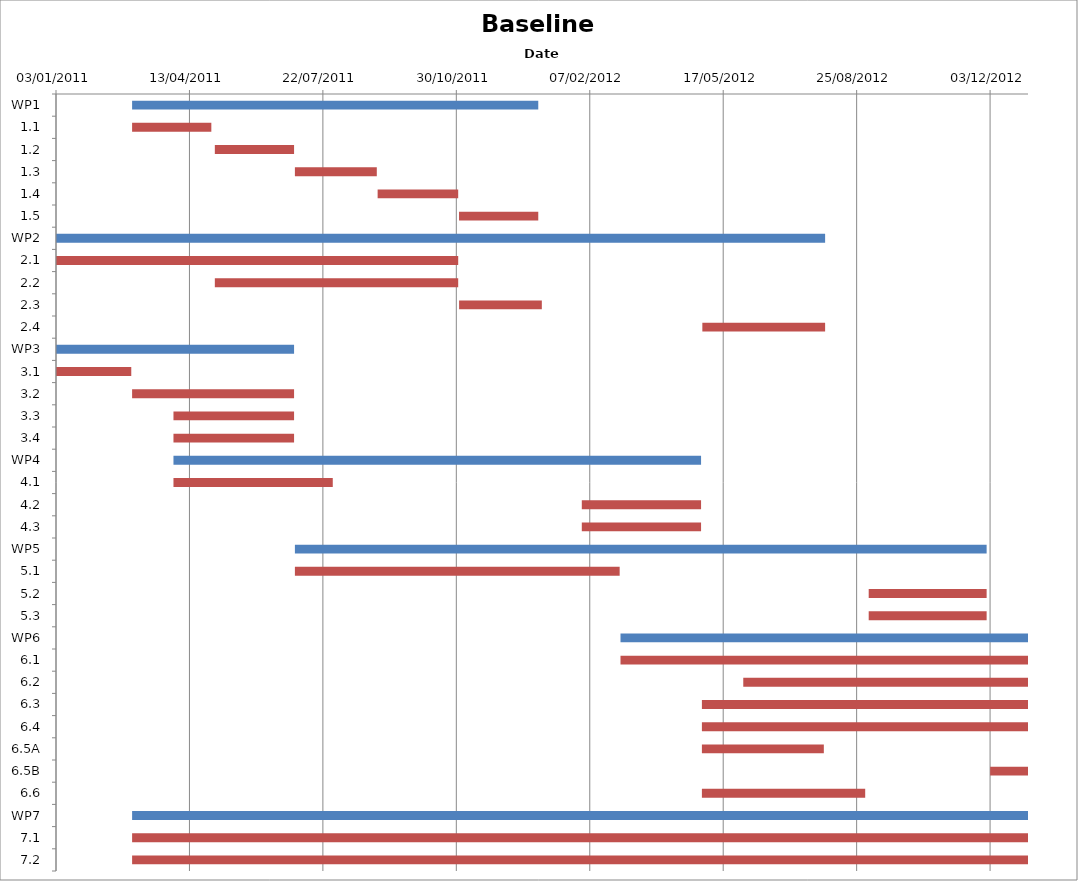
| Category | Baseline start | Actual duration |
|---|---|---|
| WP1 | 40603.333 | 304.375 |
| 1.1 | 40603.333 | 59.375 |
| 1.2 | 40665.333 | 59.375 |
| 1.3 | 40725.333 | 61.375 |
| 1.4 | 40787.333 | 60.375 |
| 1.5 | 40848.333 | 59.375 |
| WP2 | 40546.333 | 576.333 |
| 2.1 | 40546.333 | 301.375 |
| 2.2 | 40665.333 | 182.375 |
| 2.3 | 40848.375 | 62 |
| 2.4 | 41030.667 | 92 |
| WP3 | 40546.333 | 178.375 |
| 3.1 | 40546.333 | 56.375 |
| 3.2 | 40603.333 | 121.375 |
| 3.3 | 40634.333 | 90.375 |
| 3.4 | 40634.333 | 90.375 |
| WP4 | 40634.333 | 395.375 |
| 4.1 | 40634.333 | 119.375 |
| 4.2 | 40940.333 | 89.375 |
| 4.3 | 40940.333 | 89.375 |
| WP5 | 40725.333 | 518.375 |
| 5.1 | 40725.333 | 243.375 |
| 5.2 | 41155.333 | 88.375 |
| 5.3 | 41155.333 | 88.375 |
| WP6 | 40969.333 | 305.375 |
| 6.1 | 40969.333 | 305.375 |
| 6.2 | 41061.333 | 213.375 |
| 6.3 | 41030.333 | 244.375 |
| 6.4 | 41030.333 | 244.375 |
| 6.5A | 41030.333 | 91.375 |
| 6.5B | 41246.333 | 28.375 |
| 6.6 | 41030.333 | 122.375 |
| WP7 | 40603.333 | 671.375 |
| 7.1 | 40603.333 | 671.375 |
| 7.2 | 40603.333 | 671.375 |